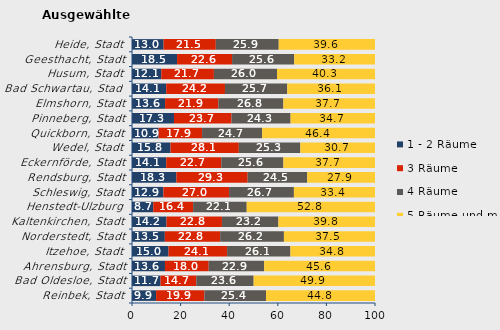
| Category | 1 - 2 Räume | 3 Räume | 4 Räume | 5 Räume und mehr |
|---|---|---|---|---|
| Reinbek, Stadt | 9.915 | 19.874 | 25.377 | 44.834 |
| Bad Oldesloe, Stadt | 11.749 | 14.703 | 23.612 | 49.935 |
| Ahrensburg, Stadt | 13.57 | 17.996 | 22.858 | 45.576 |
| Itzehoe, Stadt | 15.018 | 24.112 | 26.07 | 34.801 |
| Norderstedt, Stadt | 13.507 | 22.766 | 26.246 | 37.481 |
| Kaltenkirchen, Stadt | 14.198 | 22.813 | 23.237 | 39.753 |
| Henstedt-Ulzburg | 8.746 | 16.411 | 22.053 | 52.791 |
| Schleswig, Stadt | 12.919 | 27.03 | 26.677 | 33.373 |
| Rendsburg, Stadt | 18.268 | 29.336 | 24.502 | 27.894 |
| Eckernförde, Stadt | 14.068 | 22.659 | 25.577 | 37.697 |
| Wedel, Stadt | 15.844 | 28.126 | 25.306 | 30.723 |
| Quickborn, Stadt | 10.941 | 17.886 | 24.731 | 46.442 |
| Pinneberg, Stadt | 17.275 | 23.67 | 24.324 | 34.731 |
| Elmshorn, Stadt | 13.618 | 21.91 | 26.763 | 37.708 |
| Bad Schwartau, Stadt | 14.071 | 24.186 | 25.652 | 36.09 |
| Husum, Stadt | 12.051 | 21.657 | 25.966 | 40.327 |
| Geesthacht, Stadt | 18.544 | 22.635 | 25.585 | 33.237 |
| Heide, Stadt | 13.003 | 21.498 | 25.881 | 39.619 |